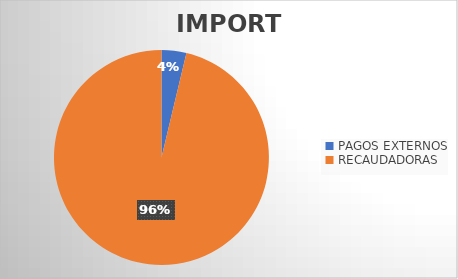
| Category | IMPORTE |
|---|---|
| PAGOS EXTERNOS | 13300177.55 |
| RECAUDADORAS | 343290918.3 |